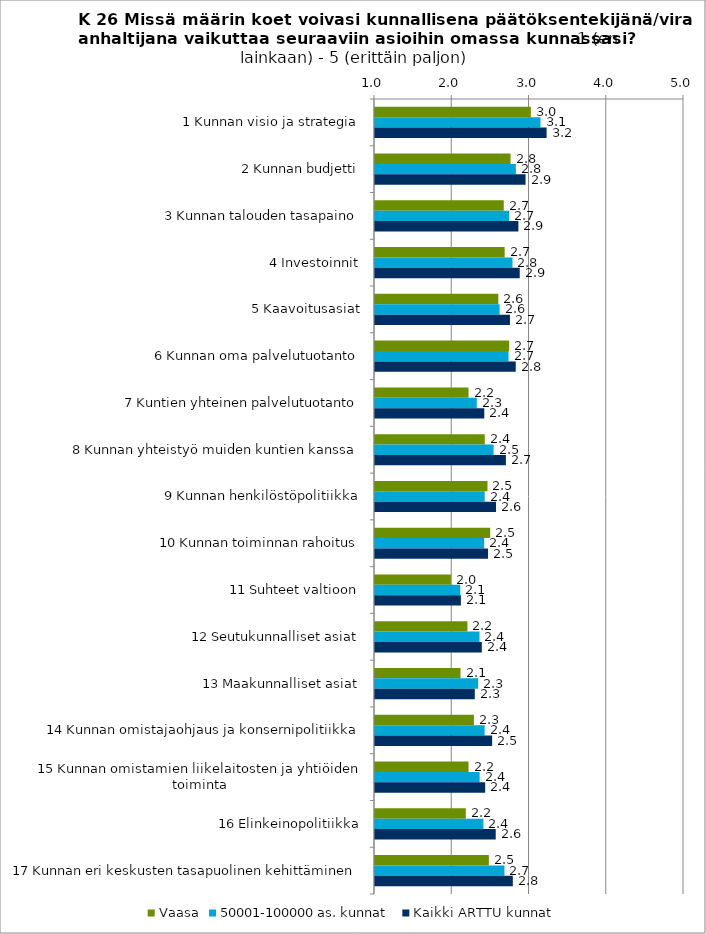
| Category | Vaasa | 50001-100000 as. kunnat | Kaikki ARTTU kunnat |
|---|---|---|---|
| 1 Kunnan visio ja strategia | 3.018 | 3.142 | 3.221 |
| 2 Kunnan budjetti | 2.754 | 2.823 | 2.949 |
| 3 Kunnan talouden tasapaino | 2.667 | 2.736 | 2.856 |
| 4 Investoinnit | 2.679 | 2.78 | 2.874 |
| 5 Kaavoitusasiat | 2.596 | 2.613 | 2.747 |
| 6 Kunnan oma palvelutuotanto | 2.737 | 2.729 | 2.822 |
| 7 Kuntien yhteinen palvelutuotanto | 2.211 | 2.317 | 2.415 |
| 8 Kunnan yhteistyö muiden kuntien kanssa | 2.421 | 2.535 | 2.694 |
| 9 Kunnan henkilöstöpolitiikka | 2.456 | 2.419 | 2.567 |
| 10 Kunnan toiminnan rahoitus | 2.491 | 2.413 | 2.463 |
| 11 Suhteet valtioon | 1.982 | 2.104 | 2.112 |
| 12 Seutukunnalliset asiat | 2.196 | 2.353 | 2.383 |
| 13 Maakunnalliset asiat | 2.107 | 2.335 | 2.292 |
| 14 Kunnan omistajaohjaus ja konsernipolitiikka | 2.281 | 2.419 | 2.516 |
| 15 Kunnan omistamien liikelaitosten ja yhtiöiden toiminta | 2.211 | 2.355 | 2.426 |
| 16 Elinkeinopolitiikka | 2.175 | 2.404 | 2.563 |
| 17 Kunnan eri keskusten tasapuolinen kehittäminen | 2.474 | 2.676 | 2.784 |